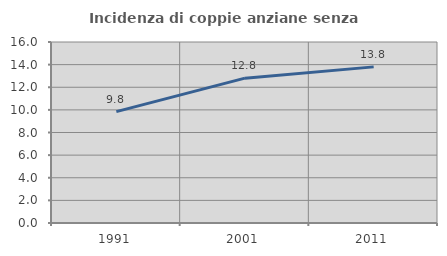
| Category | Incidenza di coppie anziane senza figli  |
|---|---|
| 1991.0 | 9.846 |
| 2001.0 | 12.805 |
| 2011.0 | 13.801 |